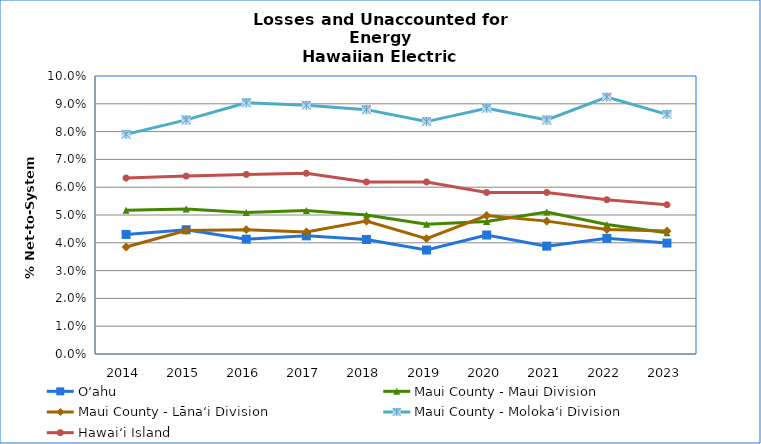
| Category | O‘ahu | Maui County - Maui Division | Maui County - Lānaʻi Division | Maui County - Moloka‘i Division | Hawai‘i Island |
|---|---|---|---|---|---|
| 2014.0 | 0.043 | 0.052 | 0.038 | 0.079 | 0.063 |
| 2015.0 | 0.045 | 0.052 | 0.044 | 0.084 | 0.064 |
| 2016.0 | 0.041 | 0.051 | 0.045 | 0.09 | 0.065 |
| 2017.0 | 0.042 | 0.052 | 0.044 | 0.09 | 0.065 |
| 2018.0 | 0.041 | 0.05 | 0.048 | 0.088 | 0.062 |
| 2019.0 | 0.037 | 0.047 | 0.042 | 0.084 | 0.062 |
| 2020.0 | 0.043 | 0.048 | 0.05 | 0.088 | 0.058 |
| 2021.0 | 0.039 | 0.051 | 0.048 | 0.084 | 0.058 |
| 2022.0 | 0.042 | 0.047 | 0.045 | 0.092 | 0.056 |
| 2023.0 | 0.04 | 0.044 | 0.044 | 0.086 | 0.054 |